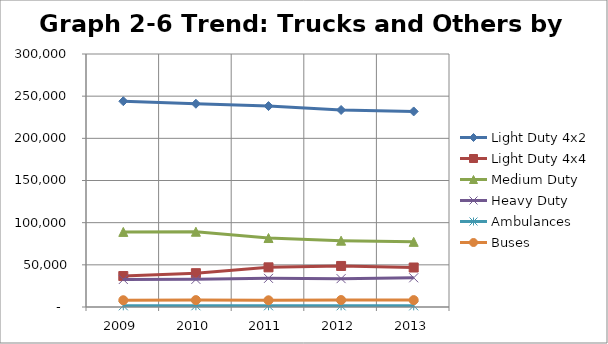
| Category | Light Duty 4x2 | Light Duty 4x4 | Medium Duty | Heavy Duty | Ambulances | Buses |
|---|---|---|---|---|---|---|
| 2009.0 | 244022 | 36713 | 89052 | 32629 | 1433 | 8040 |
| 2010.0 | 241011 | 40105 | 89253 | 32760 | 1480 | 8186 |
| 2011.0 | 238261 | 47035 | 81791 | 33951 | 1445 | 7978 |
| 2012.0 | 233629 | 48690 | 78630 | 33642 | 1401 | 8269 |
| 2013.0 | 231886 | 46830 | 77235 | 34624 | 1363 | 8186 |